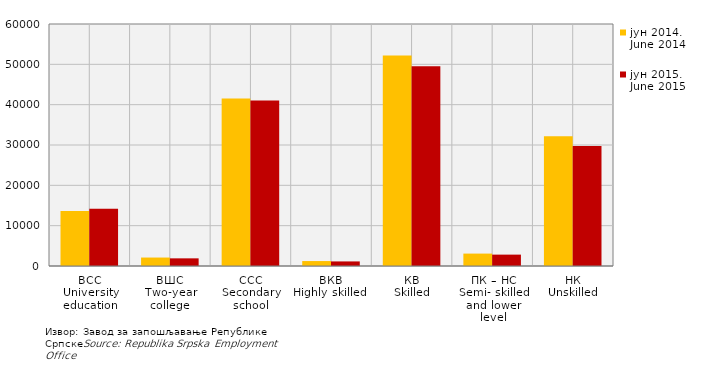
| Category | јун 2014.        Јune 2014 | јун 2015.
June 2015 |
|---|---|---|
| ВСС
University education | 13656 | 14198 |
| ВШС
Two-year college | 2096 | 1897 |
| ССС
Secondary school | 41534 | 41022 |
| ВКВ 
Highly skilled    | 1227 | 1135 |
| КВ
Skilled | 52180 | 49497 |
| ПК – НС
Semi- skilled and lower level | 3076 | 2821 |
| НК
Unskilled | 32169 | 29724 |